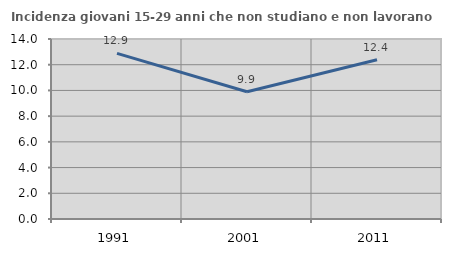
| Category | Incidenza giovani 15-29 anni che non studiano e non lavorano  |
|---|---|
| 1991.0 | 12.886 |
| 2001.0 | 9.898 |
| 2011.0 | 12.381 |